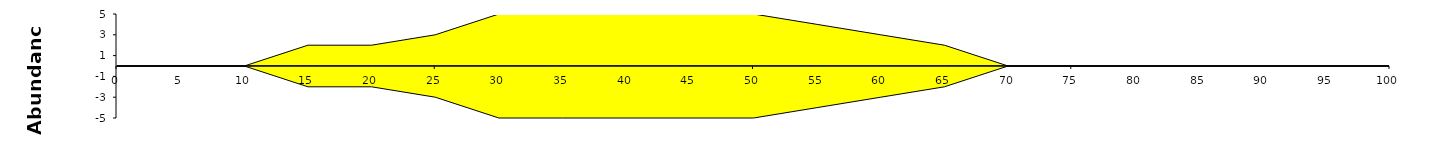
| Category | Series 0 | Series 1 |
|---|---|---|
| 0.0 | 0 | 0 |
| 5.0 | 0 | 0 |
| 10.0 | 0 | 0 |
| 15.0 | 2 | -2 |
| 20.0 | 2 | -2 |
| 25.0 | 3 | -3 |
| 30.0 | 5 | -5 |
| 35.0 | 5 | -5 |
| 40.0 | 5 | -5 |
| 45.0 | 5 | -5 |
| 50.0 | 5 | -5 |
| 55.0 | 4 | -4 |
| 60.0 | 3 | -3 |
| 65.0 | 2 | -2 |
| 70.0 | 0 | 0 |
| 75.0 | 0 | 0 |
| 80.0 | 0 | 0 |
| 85.0 | 0 | 0 |
| 90.0 | 0 | 0 |
| 95.0 | 0 | 0 |
| 100.0 | 0 | 0 |